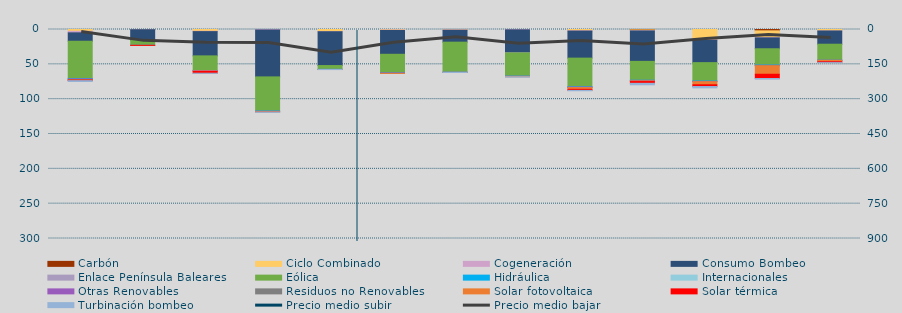
| Category | Carbón | Ciclo Combinado | Cogeneración | Consumo Bombeo | Enlace Península Baleares | Eólica | Hidráulica | Internacionales | Otras Renovables | Residuos no Renovables | Solar fotovoltaica | Solar térmica | Turbinación bombeo |
|---|---|---|---|---|---|---|---|---|---|---|---|---|---|
| 0 | 0 | 2609.1 | 2181.9 | 11984 | 0 | 53740.1 | 489.7 | 0 | 1338.8 | 61.2 | 254.1 | 740.7 | 1229 |
| 1 | 0 | 263.3 | 58 | 15135.8 | 0 | 6986.8 | 204.2 | 0 | 0 | 0 | 19.1 | 10 | 0 |
| 2 | 0 | 2541.1 | 504.6 | 34828.6 | 0 | 20974.2 | 56.9 | 0 | 659.6 | 0 | 686.2 | 2480.3 | 253.2 |
| 3 | 0 | 0 | 686.4 | 67342.6 | 0 | 49071.7 | 271.7 | 0 | 794.5 | 0 | 557.9 | 0 | 259.9 |
| 4 | 0 | 3064.1 | 163.7 | 48534.4 | 0 | 5474.1 | 38.8 | 0 | 117.5 | 0 | 22.5 | 0 | 130 |
| 5 | 0 | 754.5 | 626.3 | 34195.3 | 0 | 26304.6 | 431 | 0 | 574.8 | 3.9 | 78.7 | 0 | 0 |
| 6 | 0 | 527.6 | 537.7 | 17096.8 | 0 | 43158.6 | 57.1 | 0 | 178.1 | 0 | 29.6 | 0 | 157.5 |
| 7 | 0 | 33.9 | 492.3 | 32860 | 204 | 33430.9 | 70.8 | 0 | 339.4 | 109.7 | 324.3 | 0 | 570.1 |
| 8 | 0 | 1823.5 | 445.3 | 38830 | 0 | 40976.3 | 479.9 | 0 | 886 | 0.2 | 2434.6 | 1489.3 | 549.6 |
| 9 | 543 | 1288.6 | 238.655 | 43678.268 | 0 | 27098.515 | 150.455 | 0 | 982.208 | 13.2 | 761.432 | 2474.8 | 2164.5 |
| 10 | 0 | 14634.199 | 838.098 | 32075.867 | 0 | 26340.743 | 533.073 | 0 | 507.085 | 0 | 4421.722 | 2509.099 | 1924.625 |
| 11 | 1932.082 | 9683.392 | 448.406 | 15579.715 | 0 | 23351.965 | 345.088 | 0 | 633.184 | 108.783 | 12157.29 | 6064.342 | 913.05 |
| 12 | 0 | 2088.417 | 56.138 | 18984.933 | 0 | 23010.334 | 40.779 | 0 | 39.002 | 82.474 | 1741.959 | 1100.186 | 17.7 |